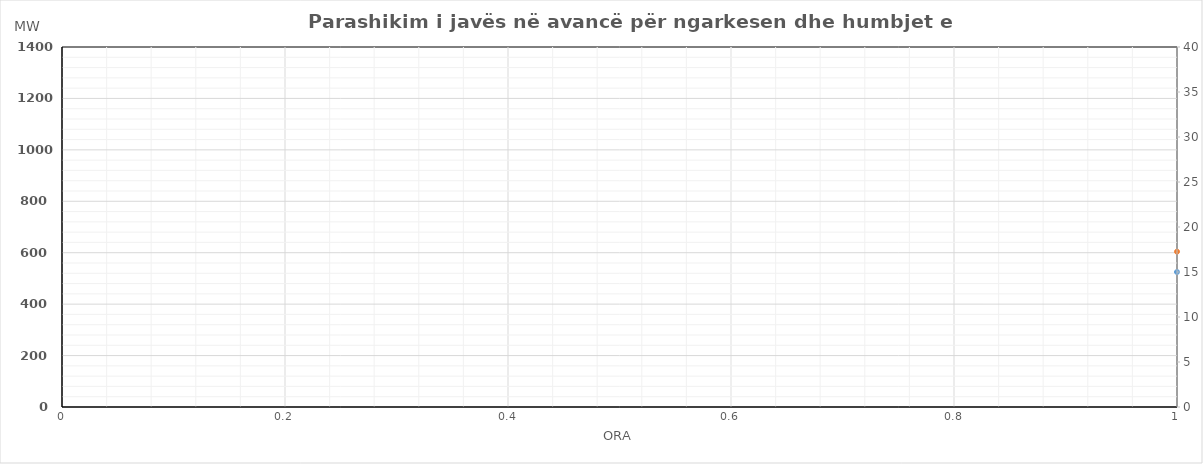
| Category | Ngarkesa (MWh) |
|---|---|
| 0 | 604.114 |
| 1 | 531.441 |
| 2 | 522.745 |
| 3 | 508.298 |
| 4 | 510.06 |
| 5 | 618.439 |
| 6 | 790.598 |
| 7 | 1017.316 |
| 8 | 1122.138 |
| 9 | 1107.435 |
| 10 | 1038.08 |
| 11 | 986.439 |
| 12 | 955.266 |
| 13 | 965.725 |
| 14 | 975.159 |
| 15 | 967.583 |
| 16 | 1000.779 |
| 17 | 1139.873 |
| 18 | 1240.038 |
| 19 | 1242.475 |
| 20 | 1210.927 |
| 21 | 1101.723 |
| 22 | 953.993 |
| 23 | 734.279 |
| 24 | 631.768 |
| 25 | 563.716 |
| 26 | 523.945 |
| 27 | 527.131 |
| 28 | 537.049 |
| 29 | 573.075 |
| 30 | 793.76 |
| 31 | 1088.425 |
| 32 | 1137.399 |
| 33 | 1055.337 |
| 34 | 972.667 |
| 35 | 933.854 |
| 36 | 956.211 |
| 37 | 966.085 |
| 38 | 978.603 |
| 39 | 954.434 |
| 40 | 979.755 |
| 41 | 1105.947 |
| 42 | 1217.776 |
| 43 | 1236.243 |
| 44 | 1217.749 |
| 45 | 1096.02 |
| 46 | 909.594 |
| 47 | 765.484 |
| 48 | 620.412 |
| 49 | 589.269 |
| 50 | 517.345 |
| 51 | 425.137 |
| 52 | 480.701 |
| 53 | 570.507 |
| 54 | 757.423 |
| 55 | 1016.367 |
| 56 | 1062.775 |
| 57 | 1040.431 |
| 58 | 983.552 |
| 59 | 946.308 |
| 60 | 940.57 |
| 61 | 980.697 |
| 62 | 986.235 |
| 63 | 975.928 |
| 64 | 1065.926 |
| 65 | 1190.909 |
| 66 | 1299.733 |
| 67 | 1259.955 |
| 68 | 1239.85 |
| 69 | 1080.364 |
| 70 | 897.163 |
| 71 | 695.304 |
| 72 | 589.828 |
| 73 | 528.171 |
| 74 | 506.926 |
| 75 | 504.969 |
| 76 | 516.507 |
| 77 | 582.18 |
| 78 | 763.587 |
| 79 | 1004.042 |
| 80 | 1049.126 |
| 81 | 1018.92 |
| 82 | 969.992 |
| 83 | 949.733 |
| 84 | 953.43 |
| 85 | 978.823 |
| 86 | 960.878 |
| 87 | 962.801 |
| 88 | 1012.794 |
| 89 | 1139.861 |
| 90 | 1220.266 |
| 91 | 1216.122 |
| 92 | 1179.218 |
| 93 | 1071.762 |
| 94 | 920.305 |
| 95 | 788.381 |
| 96 | 613.654 |
| 97 | 542.8 |
| 98 | 512.574 |
| 99 | 506.684 |
| 100 | 516.241 |
| 101 | 571.52 |
| 102 | 746.94 |
| 103 | 1129.577 |
| 104 | 1129.998 |
| 105 | 1045.518 |
| 106 | 944.733 |
| 107 | 910.632 |
| 108 | 896.889 |
| 109 | 919.524 |
| 110 | 917.692 |
| 111 | 893.848 |
| 112 | 952.625 |
| 113 | 1071.001 |
| 114 | 1138.821 |
| 115 | 1159.194 |
| 116 | 1104.387 |
| 117 | 1008.413 |
| 118 | 841.507 |
| 119 | 667.502 |
| 120 | 598.869 |
| 121 | 538.854 |
| 122 | 508.37 |
| 123 | 498.94 |
| 124 | 507.928 |
| 125 | 568.084 |
| 126 | 705.494 |
| 127 | 869.667 |
| 128 | 1014.927 |
| 129 | 1060.17 |
| 130 | 1046.957 |
| 131 | 1030.204 |
| 132 | 1031.387 |
| 133 | 1047.116 |
| 134 | 1035.038 |
| 135 | 1015.749 |
| 136 | 1035.255 |
| 137 | 1130.434 |
| 138 | 1172.195 |
| 139 | 1165.293 |
| 140 | 1104.124 |
| 141 | 1063.03 |
| 142 | 845.386 |
| 143 | 739.673 |
| 144 | 649.57 |
| 145 | 556.397 |
| 146 | 498.007 |
| 147 | 483.019 |
| 148 | 478.702 |
| 149 | 502.986 |
| 150 | 606.866 |
| 151 | 754.857 |
| 152 | 933.539 |
| 153 | 990.302 |
| 154 | 956.882 |
| 155 | 948.19 |
| 156 | 956.371 |
| 157 | 960.112 |
| 158 | 925.558 |
| 159 | 913.851 |
| 160 | 953.862 |
| 161 | 1077.607 |
| 162 | 1130.432 |
| 163 | 1137.673 |
| 164 | 1135.702 |
| 165 | 1011.4 |
| 166 | 873.377 |
| 167 | 721.049 |